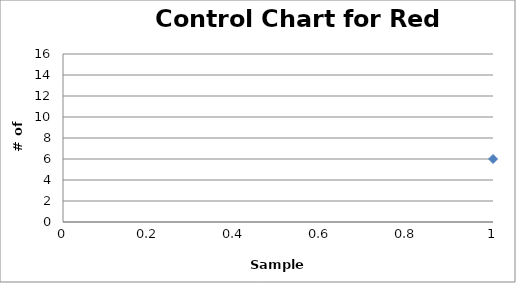
| Category | Series 0 |
|---|---|
| 0 | 6 |
| 1 | 11 |
| 2 | 8 |
| 3 | 12 |
| 4 | 10 |
| 5 | 10 |
| 6 | 5 |
| 7 | 10 |
| 8 | 15 |
| 9 | 11 |
| 10 | 11 |
| 11 | 15 |
| 12 | 12 |
| 13 | 9 |
| 14 | 11 |
| 15 | 11 |
| 16 | 12 |
| 17 | 9 |
| 18 | 12 |
| 19 | 10 |
| 20 | 6 |
| 21 | 10 |
| 22 | 14 |
| 23 | 11 |
| 24 | 7 |
| 25 | 11 |
| 26 | 6 |
| 27 | 8 |
| 28 | 12 |
| 29 | 10 |
| 30 | 10 |
| 31 | 5 |